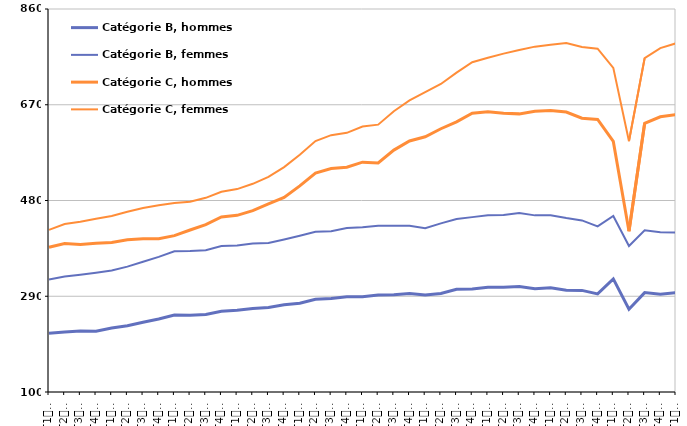
| Category | Catégorie B, hommes | Catégorie B, femmes | Catégorie C, hommes | Catégorie C, femmes |
|---|---|---|---|---|
| T1
2011 | 216.6 | 323.3 | 387.2 | 421.8 |
| T2
2011 | 219 | 329.4 | 394.7 | 433.2 |
| T3
2011 | 221.1 | 332.8 | 392.8 | 438 |
| T4
2011 | 220.4 | 336.7 | 395.3 | 443.8 |
| T1
2012 | 226.8 | 341 | 396.6 | 449.4 |
| T2
2012 | 231.6 | 348.8 | 402 | 457.5 |
| T3
2012 | 238.3 | 358.3 | 403.9 | 465 |
| T4
2012 | 244.8 | 368.1 | 404.3 | 470.6 |
| T1
2013 | 252.6 | 379.3 | 410.3 | 475 |
| T2
2013 | 252.5 | 379.6 | 421.4 | 477.5 |
| T3
2013 | 254 | 381.5 | 432 | 485.3 |
| T4
2013 | 260.4 | 389.8 | 447.3 | 497.4 |
| T1
2014 | 262 | 390.7 | 450.5 | 502.6 |
| T2
2014 | 265.8 | 394.6 | 459.9 | 513.1 |
| T3
2014 | 267.9 | 395.7 | 473.3 | 526.7 |
| T4
2014 | 273 | 402.6 | 486 | 546.3 |
| T1
2015 | 276.3 | 410 | 509.1 | 570.7 |
| T2
2015 | 284.2 | 417.8 | 534.4 | 597.9 |
| T3
2015 | 285.6 | 419.2 | 543.5 | 609.7 |
| T4
2015 | 289 | 425.3 | 546.1 | 614.3 |
| T1
2016 | 288.8 | 426.7 | 556.1 | 626.9 |
| T2
2016 | 292.4 | 430.1 | 554.4 | 630.5 |
| T3
2016 | 293.1 | 430.1 | 580 | 657.1 |
| T4
2016 | 295.4 | 430 | 598.2 | 678.5 |
| T1
2017 | 292.6 | 424.9 | 606.4 | 695.1 |
| T2
2017 | 295.6 | 434.6 | 622.4 | 711.3 |
| T3
2017 | 303.9 | 443.4 | 636.1 | 733.7 |
| T4
2017 | 304.2 | 447 | 653.1 | 754.5 |
| T1
2018 | 308 | 450.9 | 655.9 | 763.1 |
| T2
2018 | 308 | 451.1 | 653.3 | 771.5 |
| T3
2018 | 309.3 | 455.3 | 651.9 | 778.5 |
| T4
2018 | 304.9 | 450.5 | 657.3 | 785.3 |
| T1
2019 | 306.9 | 450.9 | 658.8 | 789 |
| T2
2019 | 302 | 445.2 | 655.6 | 792.3 |
| T3
2019 | 301.6 | 440.5 | 643.4 | 784.5 |
| T4
2019 | 294.7 | 428.5 | 640.9 | 781.2 |
| T1
2020 | 324.4 | 449.2 | 597.3 | 743.2 |
| T2
2020 | 264.2 | 389.8 | 419 | 597.7 |
| T3
2020 | 297.2 | 421 | 633.1 | 762.6 |
| T4
2020 | 294 | 416.8 | 646.2 | 782.4 |
| T1
2021 | 297.2 | 416.7 | 650.6 | 791.9 |